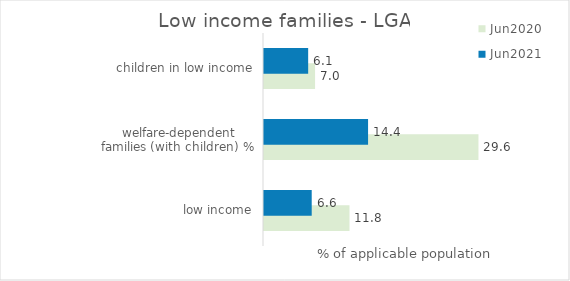
| Category | Jun2020 | Jun2021 |
|---|---|---|
| low income, welfare-dependent families (with children) % | 11.792 | 6.581 |
| children in low income, welfare-dependent families % | 29.58 | 14.354 |
| female sole parent pensioners % | 7.042 | 6.092 |